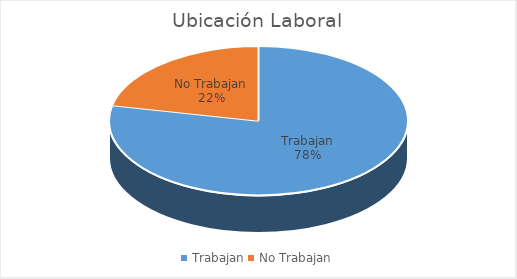
| Category | Series 0 |
|---|---|
| Trabajan | 47 |
| No Trabajan | 13 |